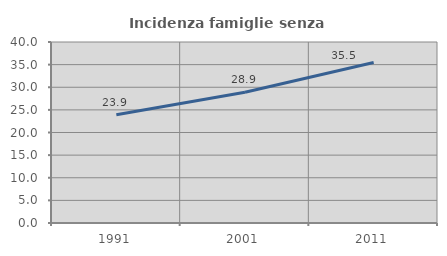
| Category | Incidenza famiglie senza nuclei |
|---|---|
| 1991.0 | 23.909 |
| 2001.0 | 28.912 |
| 2011.0 | 35.481 |